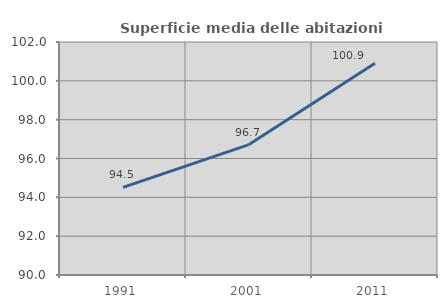
| Category | Superficie media delle abitazioni occupate |
|---|---|
| 1991.0 | 94.516 |
| 2001.0 | 96.717 |
| 2011.0 | 100.91 |